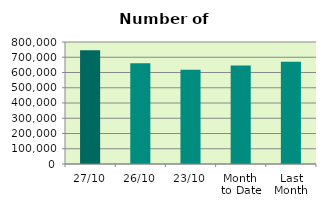
| Category | Series 0 |
|---|---|
| 27/10 | 745094 |
| 26/10 | 661354 |
| 23/10 | 617678 |
| Month 
to Date | 645829.053 |
| Last
Month | 670189.636 |